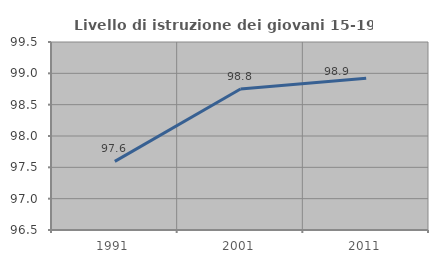
| Category | Livello di istruzione dei giovani 15-19 anni |
|---|---|
| 1991.0 | 97.595 |
| 2001.0 | 98.75 |
| 2011.0 | 98.921 |